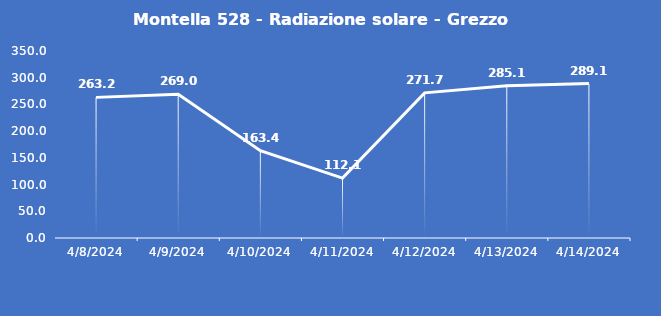
| Category | Montella 528 - Radiazione solare - Grezzo (W/m2) |
|---|---|
| 4/8/24 | 263.2 |
| 4/9/24 | 269 |
| 4/10/24 | 163.4 |
| 4/11/24 | 112.1 |
| 4/12/24 | 271.7 |
| 4/13/24 | 285.1 |
| 4/14/24 | 289.1 |